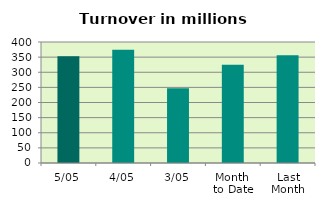
| Category | Series 0 |
|---|---|
| 5/05 | 353.217 |
| 4/05 | 374.017 |
| 3/05 | 246.892 |
| Month 
to Date | 324.709 |
| Last
Month | 356.105 |